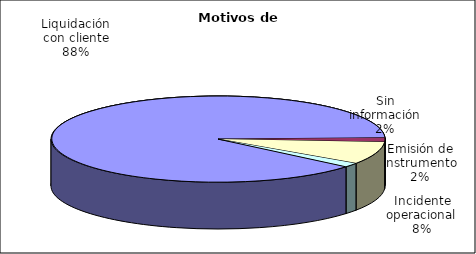
| Category | Motivos |
|---|---|
| Liquidación con cliente | 503 |
| Emisión de instrumento | 9 |
| Incidente operacional | 48 |
| Sin información | 9 |